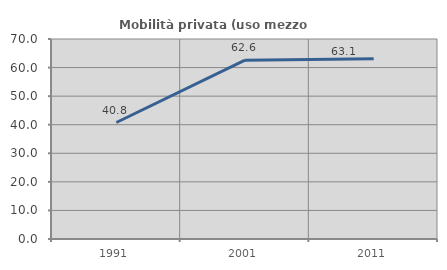
| Category | Mobilità privata (uso mezzo privato) |
|---|---|
| 1991.0 | 40.773 |
| 2001.0 | 62.583 |
| 2011.0 | 63.08 |